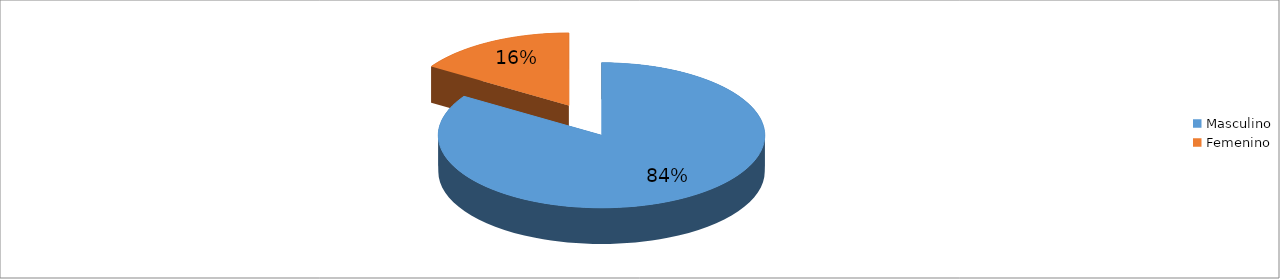
| Category | Series 0 |
|---|---|
| Masculino | 0.84 |
| Femenino | 0.16 |